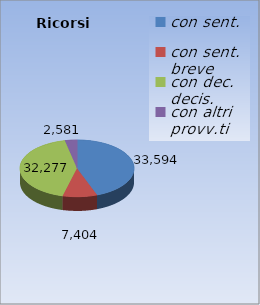
| Category | Ricorsi definiti |
|---|---|
| con sent. | 33594 |
| con sent. breve | 7404 |
| con dec. decis. | 32277 |
| con altri provv.ti | 2581 |